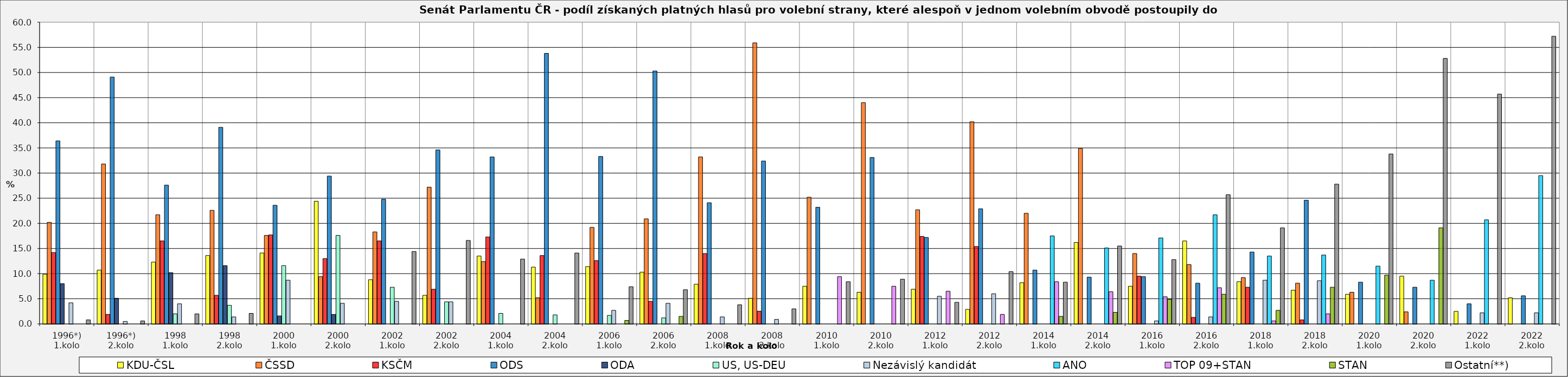
| Category | KDU-ČSL  | ČSSD | KSČM | ODS | ODA | US, US-DEU | Nezávislý kandidát | ANO | TOP 09+STAN | STAN | Ostatní**) |
|---|---|---|---|---|---|---|---|---|---|---|---|
| 1996*) 1.kolo | 9.9 | 20.2 | 14.2 | 36.4 | 8 | 0 | 4.2 | 0 | 0 | 0 | 0.8 |
| 1996*) 2.kolo | 10.7 | 31.8 | 1.9 | 49.1 | 5.1 | 0 | 0.5 | 0 | 0 | 0 | 0.6 |
| 1998 1.kolo | 12.3 | 21.7 | 16.5 | 27.6 | 10.2 | 2 | 4 | 0 | 0 | 0 | 2 |
| 1998 2.kolo | 13.6 | 22.6 | 5.7 | 39.1 | 11.6 | 3.7 | 1.4 | 0 | 0 | 0 | 2.1 |
| 2000 1.kolo | 14.1 | 17.6 | 17.7 | 23.6 | 1.6 | 11.6 | 8.7 | 0 | 0 | 0 | 0 |
| 2000 2.kolo | 24.4 | 9.4 | 13 | 29.4 | 1.9 | 17.6 | 4.1 | 0 | 0 | 0 | 0 |
| 2002 1.kolo | 8.8 | 18.3 | 16.5 | 24.8 | 0 | 7.3 | 4.5 | 0 | 0 | 0 | 14.4 |
| 2002 2.kolo | 5.7 | 27.2 | 6.9 | 34.6 | 0 | 4.4 | 4.4 | 0 | 0 | 0 | 16.6 |
| 2004 1.kolo | 13.5 | 12.4 | 17.3 | 33.2 | 0 | 2.1 | 0 | 0 | 0 | 0 | 12.9 |
| 2004 2.kolo | 11.3 | 5.2 | 13.6 | 53.8 | 0 | 1.8 | 0 | 0 | 0 | 0 | 14.1 |
| 2006 1.kolo | 11.4 | 19.2 | 12.6 | 33.3 | 0 | 1.7 | 2.7 | 0 | 0 | 0.7 | 7.4 |
| 2006 2.kolo | 10.3 | 20.9 | 4.5 | 50.3 | 0 | 1.2 | 4.1 | 0 | 0 | 1.5 | 6.8 |
| 2008 1.kolo | 7.9 | 33.2 | 14 | 24.1 | 0 | 0 | 1.4 | 0 | 0 | 0 | 3.8 |
| 2008 2.kolo | 5.1 | 55.9 | 2.54 | 32.4 | 0 | 0 | 0.9 | 0 | 0 | 0 | 3 |
| 2010 1.kolo | 7.5 | 25.2 | 0 | 23.2 | 0 | 0 | 0 | 0 | 9.4 | 0 | 8.4 |
| 2010 2.kolo | 6.3 | 44 | 0 | 33.1 | 0 | 0 | 0 | 0 | 7.5 | 0 | 8.9 |
| 2012 1.kolo | 6.9 | 22.7 | 17.4 | 17.2 | 0 | 0 | 5.5 | 0 | 6.5 | 0 | 4.3 |
| 2012 2.kolo | 2.9 | 40.2 | 15.4 | 22.9 | 0 | 0 | 6 | 0 | 1.9 | 0 | 10.4 |
| 2014 1.kolo | 8.2 | 22 | 0 | 10.7 | 0 | 0 | 0 | 17.5 | 8.4 | 1.5 | 8.3 |
| 2014 2.kolo | 16.2 | 34.9 | 0 | 9.3 | 0 | 0 | 0 | 15.1 | 6.4 | 2.3 | 15.5 |
| 2016 1.kolo | 7.5 | 14 | 9.5 | 9.4 | 0 | 0 | 0.6 | 17.1 | 5.4 | 4.9 | 12.8 |
| 2016 2.kolo | 16.5 | 11.8 | 1.3 | 8.1 | 0 | 0 | 1.4 | 21.7 | 7.2 | 5.9 | 25.7 |
| 2018 1.kolo | 8.4 | 9.2 | 7.3 | 14.3 | 0 | 0 | 8.7 | 13.5 | 0.6 | 2.7 | 19.1 |
| 2018 2.kolo | 6.7 | 8.1 | 0.8 | 24.6 | 0 | 0 | 8.6 | 13.7 | 2 | 7.3 | 27.8 |
| 2020 1.kolo | 5.9 | 6.3 | 0 | 8.3 | 0 | 0 | 0 | 11.5 | 0 | 9.7 | 33.8 |
| 2020 2.kolo | 9.5 | 2.4 | 0 | 7.3 | 0 | 0 | 0 | 8.7 | 0 | 19.1 | 52.8 |
| 2022 1.kolo | 2.5 | 0 | 0 | 4 | 0 | 0 | 2.2 | 20.7 | 0 | 0 | 45.7 |
| 2022 2.kolo | 5.2 | 0 | 0 | 5.6 | 0 | 0 | 2.2 | 29.5 | 0 | 0 | 57.2 |